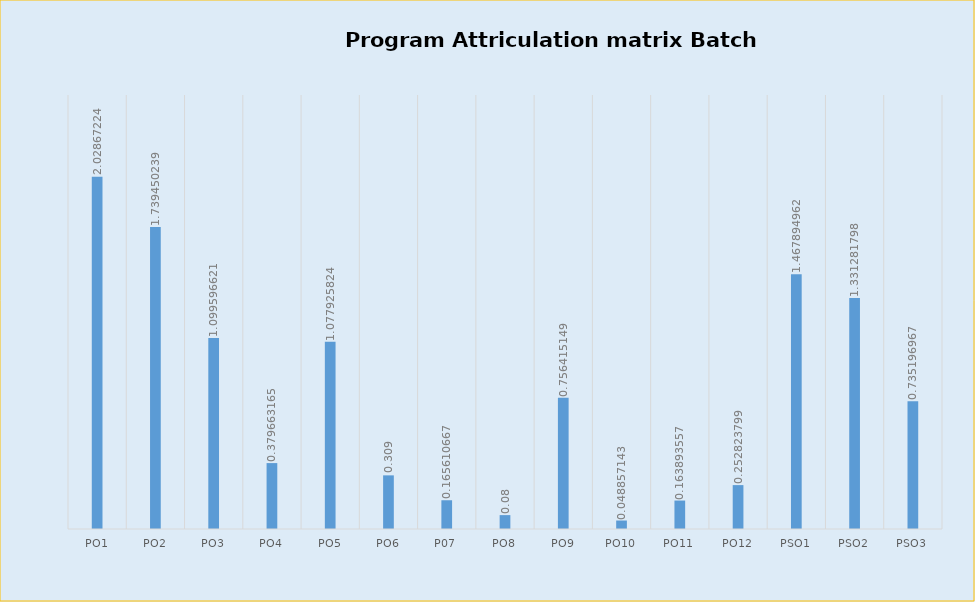
| Category | Series 0 |
|---|---|
| 0 | 2.029 |
| 1 | 1.739 |
| 2 | 1.1 |
| 3 | 0.38 |
| 4 | 1.078 |
| 5 | 0.309 |
| 6 | 0.166 |
| 7 | 0.08 |
| 8 | 0.756 |
| 9 | 0.049 |
| 10 | 0.164 |
| 11 | 0.253 |
| 12 | 1.468 |
| 13 | 1.331 |
| 14 | 0.735 |